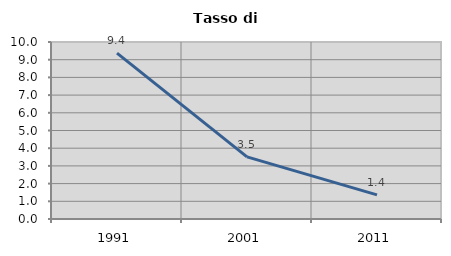
| Category | Tasso di disoccupazione   |
|---|---|
| 1991.0 | 9.375 |
| 2001.0 | 3.509 |
| 2011.0 | 1.365 |